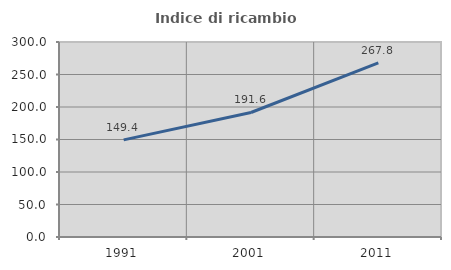
| Category | Indice di ricambio occupazionale  |
|---|---|
| 1991.0 | 149.433 |
| 2001.0 | 191.565 |
| 2011.0 | 267.826 |